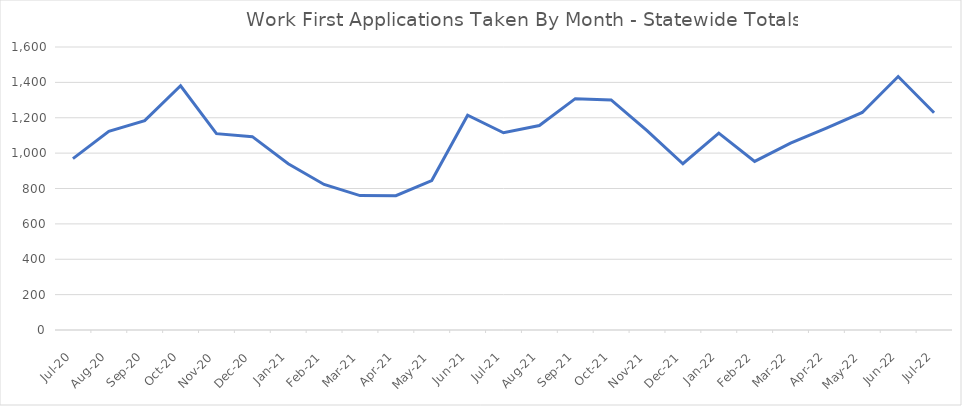
| Category | Series 0 |
|---|---|
| 2022-07-22 | 1228 |
| 2022-06-01 | 1433 |
| 2022-05-01 | 1230 |
| 2022-04-01 | 1142 |
| 2022-03-01 | 1056 |
| 2022-02-01 | 953 |
| 2022-01-01 | 1113 |
| 2021-12-02 | 940 |
| 2021-11-01 | 1127 |
| 2021-10-01 | 1301 |
| 2021-09-01 | 1308 |
| 2021-08-01 | 1156 |
| 2021-07-01 | 1115 |
| 2021-06-01 | 1214 |
| 2021-05-01 | 845 |
| 2021-04-01 | 759 |
| 2021-03-01 | 760 |
| 2021-02-01 | 823 |
| 2021-01-01 | 940 |
| 2020-12-01 | 1093 |
| 2020-11-01 | 1110 |
| 2020-10-01 | 1381 |
| 2020-09-01 | 1184 |
| 2020-08-01 | 1123 |
| 2020-07-01 | 969 |